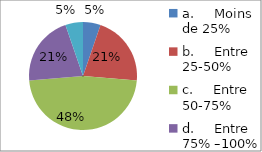
| Category | Series 0 |
|---|---|
| a.     Moins de 25%  | 0.053 |
| b.     Entre 25-50%  | 0.211 |
| c.     Entre 50-75%  | 0.474 |
| d.     Entre 75% –100%  | 0.211 |
| e.     Plus de 100%  | 0.053 |